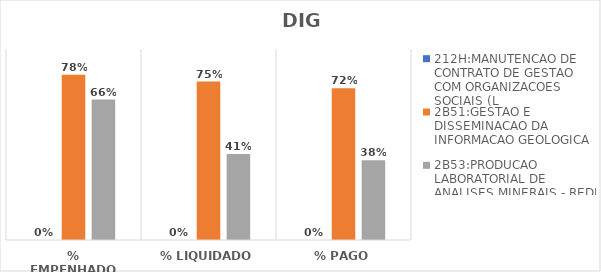
| Category | 212H:MANUTENCAO DE CONTRATO DE GESTAO COM ORGANIZACOES SOCIAIS (L | 2B51:GESTAO E DISSEMINACAO DA INFORMACAO GEOLOGICA | 2B53:PRODUCAO LABORATORIAL DE ANALISES MINERAIS - REDE LAMIN |
|---|---|---|---|
| % EMPENHADO | 0 | 0.779 | 0.662 |
| % LIQUIDADO | 0 | 0.746 | 0.405 |
| % PAGO | 0 | 0.715 | 0.376 |